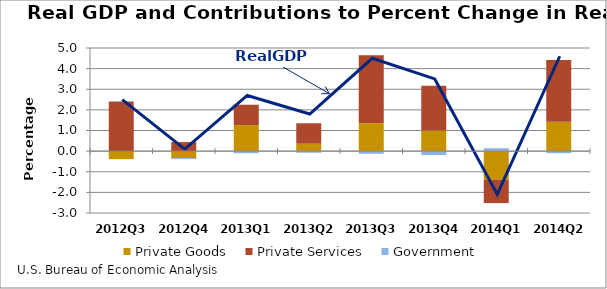
| Category | Private Goods | Private Services | Government |
|---|---|---|---|
| 2012Q3 | -0.39 | 2.41 | 0.02 |
| 2012Q4 | -0.34 | 0.44 | -0.05 |
| 2013Q1 | 1.26 | 0.99 | -0.1 |
| 2013Q2 | 0.36 | 0.99 | -0.08 |
| 2013Q3 | 1.36 | 3.29 | -0.13 |
| 2013Q4 | 1 | 2.17 | -0.19 |
| 2014Q1 | -1.39 | -1.13 | 0.14 |
| 2014Q2 | 1.43 | 2.99 | -0.1 |